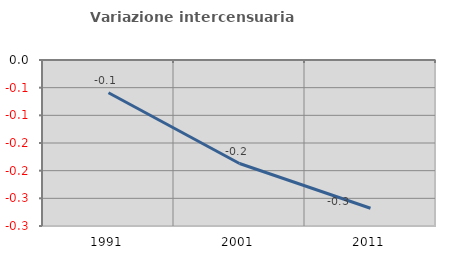
| Category | Variazione intercensuaria annua |
|---|---|
| 1991.0 | -0.059 |
| 2001.0 | -0.187 |
| 2011.0 | -0.268 |